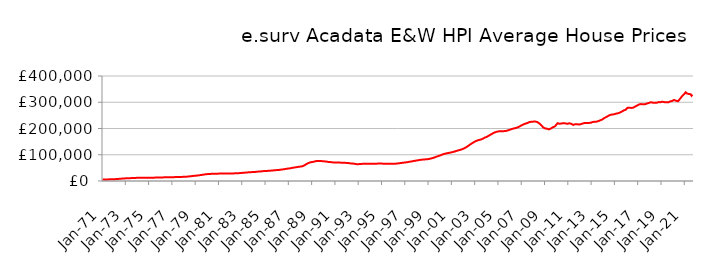
| Category | Series 0 |
|---|---|
| 1971-01-01 | 5721.637 |
| 1971-02-01 | 5762.296 |
| 1971-03-01 | 5803.295 |
| 1971-04-01 | 5856.6 |
| 1971-05-01 | 5945.059 |
| 1971-06-01 | 6037.239 |
| 1971-07-01 | 6150.593 |
| 1971-08-01 | 6273.935 |
| 1971-09-01 | 6396.293 |
| 1971-10-01 | 6523.41 |
| 1971-11-01 | 6660.635 |
| 1971-12-01 | 6827.73 |
| 1972-01-01 | 6943.709 |
| 1972-02-01 | 7019.642 |
| 1972-03-01 | 7192.485 |
| 1972-04-01 | 7434.182 |
| 1972-05-01 | 7783.4 |
| 1972-06-01 | 8089.841 |
| 1972-07-01 | 8442.17 |
| 1972-08-01 | 8782.047 |
| 1972-09-01 | 9082.157 |
| 1972-10-01 | 9362.629 |
| 1972-11-01 | 9622.344 |
| 1972-12-01 | 9890.271 |
| 1973-01-01 | 10081.941 |
| 1973-02-01 | 10217.371 |
| 1973-03-01 | 10373.062 |
| 1973-04-01 | 10550.653 |
| 1973-05-01 | 10778.346 |
| 1973-06-01 | 10926.279 |
| 1973-07-01 | 11081.212 |
| 1973-08-01 | 11253.08 |
| 1973-09-01 | 11453.654 |
| 1973-10-01 | 11661.609 |
| 1973-11-01 | 11820.086 |
| 1973-12-01 | 11933.729 |
| 1974-01-01 | 11994.68 |
| 1974-02-01 | 12060.371 |
| 1974-03-01 | 12057.68 |
| 1974-04-01 | 12031.652 |
| 1974-05-01 | 12008.684 |
| 1974-06-01 | 12009.52 |
| 1974-07-01 | 12021.199 |
| 1974-08-01 | 12060.402 |
| 1974-09-01 | 12131.717 |
| 1974-10-01 | 12219.316 |
| 1974-11-01 | 12291.911 |
| 1974-12-01 | 12363.582 |
| 1975-01-01 | 12396.74 |
| 1975-02-01 | 12438.568 |
| 1975-03-01 | 12512.8 |
| 1975-04-01 | 12618.502 |
| 1975-05-01 | 12746.827 |
| 1975-06-01 | 12815.529 |
| 1975-07-01 | 12882.897 |
| 1975-08-01 | 12975.913 |
| 1975-09-01 | 13101.794 |
| 1975-10-01 | 13241.651 |
| 1975-11-01 | 13364.792 |
| 1975-12-01 | 13496.487 |
| 1976-01-01 | 13589.21 |
| 1976-02-01 | 13676.529 |
| 1976-03-01 | 13736.277 |
| 1976-04-01 | 13799.828 |
| 1976-05-01 | 13882.974 |
| 1976-06-01 | 13937.373 |
| 1976-07-01 | 13997.548 |
| 1976-08-01 | 14086.604 |
| 1976-09-01 | 14214.053 |
| 1976-10-01 | 14357.689 |
| 1976-11-01 | 14472.621 |
| 1976-12-01 | 14575.256 |
| 1977-01-01 | 14632.325 |
| 1977-02-01 | 14697.865 |
| 1977-03-01 | 14740.363 |
| 1977-04-01 | 14790.21 |
| 1977-05-01 | 14867.201 |
| 1977-06-01 | 14937.016 |
| 1977-07-01 | 15022.857 |
| 1977-08-01 | 15140.588 |
| 1977-09-01 | 15284.567 |
| 1977-10-01 | 15446.76 |
| 1977-11-01 | 15618.347 |
| 1977-12-01 | 15842.314 |
| 1978-01-01 | 16008.634 |
| 1978-02-01 | 16138.444 |
| 1978-03-01 | 16313.376 |
| 1978-04-01 | 16548.702 |
| 1978-05-01 | 16925.958 |
| 1978-06-01 | 17307.721 |
| 1978-07-01 | 17769.442 |
| 1978-08-01 | 18243.045 |
| 1978-09-01 | 18698.842 |
| 1978-10-01 | 19152.07 |
| 1978-11-01 | 19574.7 |
| 1978-12-01 | 19992.283 |
| 1979-01-01 | 20240.686 |
| 1979-02-01 | 20407.294 |
| 1979-03-01 | 20822.308 |
| 1979-04-01 | 21391.186 |
| 1979-05-01 | 22117.161 |
| 1979-06-01 | 22577.858 |
| 1979-07-01 | 23056.032 |
| 1979-08-01 | 23594.497 |
| 1979-09-01 | 24239.606 |
| 1979-10-01 | 24928.227 |
| 1979-11-01 | 25501.578 |
| 1979-12-01 | 25947.078 |
| 1980-01-01 | 26191.666 |
| 1980-02-01 | 26381.777 |
| 1980-03-01 | 26625.705 |
| 1980-04-01 | 26911.328 |
| 1980-05-01 | 27245.442 |
| 1980-06-01 | 27424.169 |
| 1980-07-01 | 27586.236 |
| 1980-08-01 | 27736.009 |
| 1980-09-01 | 27841.614 |
| 1980-10-01 | 27909.24 |
| 1980-11-01 | 27961.216 |
| 1980-12-01 | 28071.794 |
| 1981-01-01 | 28137.528 |
| 1981-02-01 | 28237.242 |
| 1981-03-01 | 28337.226 |
| 1981-04-01 | 28471.422 |
| 1981-05-01 | 28607.481 |
| 1981-06-01 | 28653.642 |
| 1981-07-01 | 28675.655 |
| 1981-08-01 | 28681.095 |
| 1981-09-01 | 28627.074 |
| 1981-10-01 | 28528.492 |
| 1981-11-01 | 28437.987 |
| 1981-12-01 | 28428.134 |
| 1982-01-01 | 28384.207 |
| 1982-02-01 | 28403.446 |
| 1982-03-01 | 28560.962 |
| 1982-04-01 | 28826.348 |
| 1982-05-01 | 29123.624 |
| 1982-06-01 | 29232.109 |
| 1982-07-01 | 29313.958 |
| 1982-08-01 | 29470.039 |
| 1982-09-01 | 29723.125 |
| 1982-10-01 | 30023.812 |
| 1982-11-01 | 30323.377 |
| 1982-12-01 | 30694.881 |
| 1983-01-01 | 30977.174 |
| 1983-02-01 | 31219.783 |
| 1983-03-01 | 31472.577 |
| 1983-04-01 | 31785.86 |
| 1983-05-01 | 32196.746 |
| 1983-06-01 | 32519.187 |
| 1983-07-01 | 32870.27 |
| 1983-08-01 | 33203.815 |
| 1983-09-01 | 33470.441 |
| 1983-10-01 | 33688.574 |
| 1983-11-01 | 33894.414 |
| 1983-12-01 | 34164.762 |
| 1984-01-01 | 34326.341 |
| 1984-02-01 | 34490.39 |
| 1984-03-01 | 34801.858 |
| 1984-04-01 | 35233.922 |
| 1984-05-01 | 35728.512 |
| 1984-06-01 | 35947.792 |
| 1984-07-01 | 36131.309 |
| 1984-08-01 | 36410.916 |
| 1984-09-01 | 36857.095 |
| 1984-10-01 | 37373.309 |
| 1984-11-01 | 37772.28 |
| 1984-12-01 | 38049.568 |
| 1985-01-01 | 38126.541 |
| 1985-02-01 | 38232.92 |
| 1985-03-01 | 38494.448 |
| 1985-04-01 | 38861.795 |
| 1985-05-01 | 39281.243 |
| 1985-06-01 | 39443.336 |
| 1985-07-01 | 39593.189 |
| 1985-08-01 | 39852.962 |
| 1985-09-01 | 40286.193 |
| 1985-10-01 | 40780.974 |
| 1985-11-01 | 41196.83 |
| 1985-12-01 | 41529.429 |
| 1986-01-01 | 41658.708 |
| 1986-02-01 | 41790.707 |
| 1986-03-01 | 42176.28 |
| 1986-04-01 | 42734.024 |
| 1986-05-01 | 43430.153 |
| 1986-06-01 | 43851.604 |
| 1986-07-01 | 44282.443 |
| 1986-08-01 | 44796.764 |
| 1986-09-01 | 45443.204 |
| 1986-10-01 | 46141.317 |
| 1986-11-01 | 46774.998 |
| 1986-12-01 | 47365.819 |
| 1987-01-01 | 47708.6 |
| 1987-02-01 | 47992.425 |
| 1987-03-01 | 48608.074 |
| 1987-04-01 | 49436.983 |
| 1987-05-01 | 50427.396 |
| 1987-06-01 | 50986.248 |
| 1987-07-01 | 51520.875 |
| 1987-08-01 | 52109.244 |
| 1987-09-01 | 52747.907 |
| 1987-10-01 | 53409.041 |
| 1987-11-01 | 54028.462 |
| 1987-12-01 | 54670.064 |
| 1988-01-01 | 54975.068 |
| 1988-02-01 | 55238.121 |
| 1988-03-01 | 56158.153 |
| 1988-04-01 | 57542.733 |
| 1988-05-01 | 59626.022 |
| 1988-06-01 | 61728.232 |
| 1988-07-01 | 64203.536 |
| 1988-08-01 | 66480.514 |
| 1988-09-01 | 68233.782 |
| 1988-10-01 | 69689.501 |
| 1988-11-01 | 70860.28 |
| 1988-12-01 | 71899.755 |
| 1989-01-01 | 72443.122 |
| 1989-02-01 | 72902.486 |
| 1989-03-01 | 73682.173 |
| 1989-04-01 | 74674.86 |
| 1989-05-01 | 75726.533 |
| 1989-06-01 | 76186.029 |
| 1989-07-01 | 76498.876 |
| 1989-08-01 | 76645.547 |
| 1989-09-01 | 76519.1 |
| 1989-10-01 | 76165.266 |
| 1989-11-01 | 75694.544 |
| 1989-12-01 | 75310.879 |
| 1990-01-01 | 74965.571 |
| 1990-02-01 | 74951.401 |
| 1990-03-01 | 74436.887 |
| 1990-04-01 | 73769.099 |
| 1990-05-01 | 72988.276 |
| 1990-06-01 | 72615.68 |
| 1990-07-01 | 72298.179 |
| 1990-08-01 | 71988.705 |
| 1990-09-01 | 71553.822 |
| 1990-10-01 | 71056.748 |
| 1990-11-01 | 70595.419 |
| 1990-12-01 | 70399.45 |
| 1991-01-01 | 70261.691 |
| 1991-02-01 | 70335.512 |
| 1991-03-01 | 70223.689 |
| 1991-04-01 | 70149.821 |
| 1991-05-01 | 70052.594 |
| 1991-06-01 | 70009.084 |
| 1991-07-01 | 69962.851 |
| 1991-08-01 | 69897.993 |
| 1991-09-01 | 69786.979 |
| 1991-10-01 | 69588.396 |
| 1991-11-01 | 69263.131 |
| 1991-12-01 | 68919.119 |
| 1992-01-01 | 68578.405 |
| 1992-02-01 | 68526.157 |
| 1992-03-01 | 68048.234 |
| 1992-04-01 | 67471.368 |
| 1992-05-01 | 66834.583 |
| 1992-06-01 | 66626.137 |
| 1992-07-01 | 66476.266 |
| 1992-08-01 | 66161.735 |
| 1992-09-01 | 65490.411 |
| 1992-10-01 | 64657.436 |
| 1992-11-01 | 64092.776 |
| 1992-12-01 | 64109.213 |
| 1993-01-01 | 64267.822 |
| 1993-02-01 | 64548.5 |
| 1993-03-01 | 64800.703 |
| 1993-04-01 | 65116.213 |
| 1993-05-01 | 65385.205 |
| 1993-06-01 | 65415.975 |
| 1993-07-01 | 65435.438 |
| 1993-08-01 | 65489.316 |
| 1993-09-01 | 65448.33 |
| 1993-10-01 | 65330.402 |
| 1993-11-01 | 65253.231 |
| 1993-12-01 | 65481.666 |
| 1994-01-01 | 65795.911 |
| 1994-02-01 | 66187.658 |
| 1994-03-01 | 66172.726 |
| 1994-04-01 | 66012.999 |
| 1994-05-01 | 65872.726 |
| 1994-06-01 | 65885.299 |
| 1994-07-01 | 65964.465 |
| 1994-08-01 | 66127.292 |
| 1994-09-01 | 66386.103 |
| 1994-10-01 | 66699.652 |
| 1994-11-01 | 66848.045 |
| 1994-12-01 | 66760.501 |
| 1995-01-01 | 66271.317 |
| 1995-02-01 | 65850.218 |
| 1995-03-01 | 65691.881 |
| 1995-04-01 | 65526.898 |
| 1995-05-01 | 65554.846 |
| 1995-06-01 | 65415.772 |
| 1995-07-01 | 65558.368 |
| 1995-08-01 | 65621.703 |
| 1995-09-01 | 65659.154 |
| 1995-10-01 | 65635.619 |
| 1995-11-01 | 65718.381 |
| 1995-12-01 | 65799.005 |
| 1996-01-01 | 65822.874 |
| 1996-02-01 | 65782.824 |
| 1996-03-01 | 66000.184 |
| 1996-04-01 | 66256.695 |
| 1996-05-01 | 66744.04 |
| 1996-06-01 | 67100.794 |
| 1996-07-01 | 67683.378 |
| 1996-08-01 | 68247.062 |
| 1996-09-01 | 68816.57 |
| 1996-10-01 | 69231.247 |
| 1996-11-01 | 69670.904 |
| 1996-12-01 | 70292.598 |
| 1997-01-01 | 70738.527 |
| 1997-02-01 | 71213.588 |
| 1997-03-01 | 71619.33 |
| 1997-04-01 | 72277.827 |
| 1997-05-01 | 73137.953 |
| 1997-06-01 | 73791.083 |
| 1997-07-01 | 74252.184 |
| 1997-08-01 | 74987.177 |
| 1997-09-01 | 75644.772 |
| 1997-10-01 | 76496.497 |
| 1997-11-01 | 77092.068 |
| 1997-12-01 | 77848.446 |
| 1998-01-01 | 78297.188 |
| 1998-02-01 | 78971.066 |
| 1998-03-01 | 79558.894 |
| 1998-04-01 | 80288.676 |
| 1998-05-01 | 80807.089 |
| 1998-06-01 | 81125.572 |
| 1998-07-01 | 81506.943 |
| 1998-08-01 | 81863.791 |
| 1998-09-01 | 82224.992 |
| 1998-10-01 | 82464.657 |
| 1998-11-01 | 82744.276 |
| 1998-12-01 | 83080.436 |
| 1999-01-01 | 83577.993 |
| 1999-02-01 | 84571.705 |
| 1999-03-01 | 85447.682 |
| 1999-04-01 | 86316.681 |
| 1999-05-01 | 87268.309 |
| 1999-06-01 | 88275.026 |
| 1999-07-01 | 89460.227 |
| 1999-08-01 | 90994.233 |
| 1999-09-01 | 92557.97 |
| 1999-10-01 | 93994.71 |
| 1999-11-01 | 94970.284 |
| 1999-12-01 | 96280.655 |
| 2000-01-01 | 97325.701 |
| 2000-02-01 | 99209.663 |
| 2000-03-01 | 100688.495 |
| 2000-04-01 | 102265.077 |
| 2000-05-01 | 103063.262 |
| 2000-06-01 | 104041.767 |
| 2000-07-01 | 104914.739 |
| 2000-08-01 | 105728.177 |
| 2000-09-01 | 106483.482 |
| 2000-10-01 | 107259.346 |
| 2000-11-01 | 107898.373 |
| 2000-12-01 | 108711.995 |
| 2001-01-01 | 109371.114 |
| 2001-02-01 | 110393.728 |
| 2001-03-01 | 111350.355 |
| 2001-04-01 | 112525.531 |
| 2001-05-01 | 113793.316 |
| 2001-06-01 | 114844.266 |
| 2001-07-01 | 115990.605 |
| 2001-08-01 | 117133.207 |
| 2001-09-01 | 118167.979 |
| 2001-10-01 | 118862.601 |
| 2001-11-01 | 120047.789 |
| 2001-12-01 | 121360.722 |
| 2002-01-01 | 123114.809 |
| 2002-02-01 | 124819.005 |
| 2002-03-01 | 126855.333 |
| 2002-04-01 | 129047.909 |
| 2002-05-01 | 131523.479 |
| 2002-06-01 | 134030.721 |
| 2002-07-01 | 136776.102 |
| 2002-08-01 | 139215.035 |
| 2002-09-01 | 141803.563 |
| 2002-10-01 | 144227.825 |
| 2002-11-01 | 146357.451 |
| 2002-12-01 | 148702.365 |
| 2003-01-01 | 150794.009 |
| 2003-02-01 | 152510.864 |
| 2003-03-01 | 153898.607 |
| 2003-04-01 | 155226.269 |
| 2003-05-01 | 156353.205 |
| 2003-06-01 | 157259.237 |
| 2003-07-01 | 158057.815 |
| 2003-08-01 | 159627.899 |
| 2003-09-01 | 161267.535 |
| 2003-10-01 | 163410.624 |
| 2003-11-01 | 165491.163 |
| 2003-12-01 | 167233.597 |
| 2004-01-01 | 167957.067 |
| 2004-02-01 | 170238.124 |
| 2004-03-01 | 172480.568 |
| 2004-04-01 | 174513.653 |
| 2004-05-01 | 176743.804 |
| 2004-06-01 | 178895.701 |
| 2004-07-01 | 180975.64 |
| 2004-08-01 | 183049.298 |
| 2004-09-01 | 184672.192 |
| 2004-10-01 | 186320.382 |
| 2004-11-01 | 187184.644 |
| 2004-12-01 | 188206.909 |
| 2005-01-01 | 189021.112 |
| 2005-02-01 | 190183.952 |
| 2005-03-01 | 190005.817 |
| 2005-04-01 | 190071.875 |
| 2005-05-01 | 189485.539 |
| 2005-06-01 | 190073.366 |
| 2005-07-01 | 190099.846 |
| 2005-08-01 | 190409.416 |
| 2005-09-01 | 191025.705 |
| 2005-10-01 | 192128.229 |
| 2005-11-01 | 193022.749 |
| 2005-12-01 | 194589.472 |
| 2006-01-01 | 195561.889 |
| 2006-02-01 | 197180.233 |
| 2006-03-01 | 198290.018 |
| 2006-04-01 | 199521.21 |
| 2006-05-01 | 200291.878 |
| 2006-06-01 | 200874.24 |
| 2006-07-01 | 201753.772 |
| 2006-08-01 | 202945.476 |
| 2006-09-01 | 204665.909 |
| 2006-10-01 | 206669.853 |
| 2006-11-01 | 208271.992 |
| 2006-12-01 | 210431.706 |
| 2007-01-01 | 212236.573 |
| 2007-02-01 | 214691.924 |
| 2007-03-01 | 215960.598 |
| 2007-04-01 | 217668.208 |
| 2007-05-01 | 218745.526 |
| 2007-06-01 | 220436.757 |
| 2007-07-01 | 221128.98 |
| 2007-08-01 | 222903.284 |
| 2007-09-01 | 224639.27 |
| 2007-10-01 | 225909.983 |
| 2007-11-01 | 225637.65 |
| 2007-12-01 | 225795.991 |
| 2008-01-01 | 226230.744 |
| 2008-02-01 | 227150.677 |
| 2008-03-01 | 226536.237 |
| 2008-04-01 | 226088.749 |
| 2008-05-01 | 224583.894 |
| 2008-06-01 | 222870.934 |
| 2008-07-01 | 219624.904 |
| 2008-08-01 | 216697.269 |
| 2008-09-01 | 213087.292 |
| 2008-10-01 | 209193.305 |
| 2008-11-01 | 204692.274 |
| 2008-12-01 | 201599.231 |
| 2009-01-01 | 200403.32 |
| 2009-02-01 | 201116.809 |
| 2009-03-01 | 199383.582 |
| 2009-04-01 | 198315.606 |
| 2009-05-01 | 196756.715 |
| 2009-06-01 | 198255.489 |
| 2009-07-01 | 199781.16 |
| 2009-08-01 | 202057.625 |
| 2009-09-01 | 204651.712 |
| 2009-10-01 | 206995.738 |
| 2009-11-01 | 207417.779 |
| 2009-12-01 | 211553.202 |
| 2010-01-01 | 214966.047 |
| 2010-02-01 | 220222.605 |
| 2010-03-01 | 218833.653 |
| 2010-04-01 | 218095.869 |
| 2010-05-01 | 218270.945 |
| 2010-06-01 | 219021.418 |
| 2010-07-01 | 219694.86 |
| 2010-08-01 | 220453.705 |
| 2010-09-01 | 220333.072 |
| 2010-10-01 | 219430.502 |
| 2010-11-01 | 217758.718 |
| 2010-12-01 | 217843.886 |
| 2011-01-01 | 218308.872 |
| 2011-02-01 | 219903.599 |
| 2011-03-01 | 220093.176 |
| 2011-04-01 | 217992.594 |
| 2011-05-01 | 215269.271 |
| 2011-06-01 | 213677.232 |
| 2011-07-01 | 214756.836 |
| 2011-08-01 | 216261.648 |
| 2011-09-01 | 216160.859 |
| 2011-10-01 | 216413 |
| 2011-11-01 | 215076.714 |
| 2011-12-01 | 215195.615 |
| 2012-01-01 | 215831.279 |
| 2012-02-01 | 216608.392 |
| 2012-03-01 | 218433.925 |
| 2012-04-01 | 219229.758 |
| 2012-05-01 | 221315.79 |
| 2012-06-01 | 221273.57 |
| 2012-07-01 | 221114.337 |
| 2012-08-01 | 220621.314 |
| 2012-09-01 | 220819.802 |
| 2012-10-01 | 221141.866 |
| 2012-11-01 | 221164.226 |
| 2012-12-01 | 221860.869 |
| 2013-01-01 | 222596.882 |
| 2013-02-01 | 224450.937 |
| 2013-03-01 | 225296.589 |
| 2013-04-01 | 225849.652 |
| 2013-05-01 | 225718.614 |
| 2013-06-01 | 226002.925 |
| 2013-07-01 | 226930.605 |
| 2013-08-01 | 228408.536 |
| 2013-09-01 | 229824.697 |
| 2013-10-01 | 231209.99 |
| 2013-11-01 | 232088.932 |
| 2013-12-01 | 234238.428 |
| 2014-01-01 | 237365.145 |
| 2014-02-01 | 239694.72 |
| 2014-03-01 | 242055.681 |
| 2014-04-01 | 243338.29 |
| 2014-05-01 | 245816.756 |
| 2014-06-01 | 247723.782 |
| 2014-07-01 | 249499.817 |
| 2014-08-01 | 251313.134 |
| 2014-09-01 | 252749.811 |
| 2014-10-01 | 253554.587 |
| 2014-11-01 | 253513.511 |
| 2014-12-01 | 253886.163 |
| 2015-01-01 | 255260.291 |
| 2015-02-01 | 256442.252 |
| 2015-03-01 | 257148.908 |
| 2015-04-01 | 257702.233 |
| 2015-05-01 | 258891.89 |
| 2015-06-01 | 260266.761 |
| 2015-07-01 | 261578.962 |
| 2015-08-01 | 264001.261 |
| 2015-09-01 | 265964.492 |
| 2015-10-01 | 268628.509 |
| 2015-11-01 | 269111.396 |
| 2015-12-01 | 271150.763 |
| 2016-01-01 | 273132.57 |
| 2016-02-01 | 278749.158 |
| 2016-03-01 | 279015.252 |
| 2016-04-01 | 279083.931 |
| 2016-05-01 | 277191.159 |
| 2016-06-01 | 278300.659 |
| 2016-07-01 | 278735.279 |
| 2016-08-01 | 279550.537 |
| 2016-09-01 | 281143.525 |
| 2016-10-01 | 283844.145 |
| 2016-11-01 | 285456.064 |
| 2016-12-01 | 287658.857 |
| 2017-01-01 | 289822.876 |
| 2017-02-01 | 291690.019 |
| 2017-03-01 | 293217.574 |
| 2017-04-01 | 293135.305 |
| 2017-05-01 | 293034.824 |
| 2017-06-01 | 291896.223 |
| 2017-07-01 | 291758.358 |
| 2017-08-01 | 292226.381 |
| 2017-09-01 | 294023.961 |
| 2017-10-01 | 295304.478 |
| 2017-11-01 | 296276.989 |
| 2017-12-01 | 297197.81 |
| 2018-01-01 | 298811.713 |
| 2018-02-01 | 300029.625 |
| 2018-03-01 | 299205.749 |
| 2018-04-01 | 298409.542 |
| 2018-05-01 | 297506.941 |
| 2018-06-01 | 297959.121 |
| 2018-07-01 | 297018.79 |
| 2018-08-01 | 297858.66 |
| 2018-09-01 | 298624.478 |
| 2018-10-01 | 300545.418 |
| 2018-11-01 | 299652.448 |
| 2018-12-01 | 300349.168 |
| 2019-01-01 | 300797.826 |
| 2019-02-01 | 302149.078 |
| 2019-03-01 | 301209.863 |
| 2019-04-01 | 300448.054 |
| 2019-05-01 | 300433.595 |
| 2019-06-01 | 300235.304 |
| 2019-07-01 | 299725.745 |
| 2019-08-01 | 299567.415 |
| 2019-09-01 | 301214.163 |
| 2019-10-01 | 303183.912 |
| 2019-11-01 | 304171.981 |
| 2019-12-01 | 305035.152 |
| 2020-01-01 | 306322.328 |
| 2020-02-01 | 308735.04 |
| 2020-03-01 | 308876.055 |
| 2020-04-01 | 305961.464 |
| 2020-05-01 | 303438.365 |
| 2020-06-01 | 303865.64 |
| 2020-07-01 | 307882.602 |
| 2020-08-01 | 312681.302 |
| 2020-09-01 | 317069.531 |
| 2020-10-01 | 322139.168 |
| 2020-11-01 | 324756.601 |
| 2020-12-01 | 329424.305 |
| 2021-01-01 | 332242.539 |
| 2021-02-01 | 338131.572 |
| 2021-03-01 | 334039.609 |
| 2021-04-01 | 330704.59 |
| 2021-05-01 | 331528.615 |
| 2021-06-01 | 330227.645 |
| 2021-07-01 | 330615.564 |
| 2021-08-01 | 324671.469 |
| 2021-09-01 | 328610.461 |